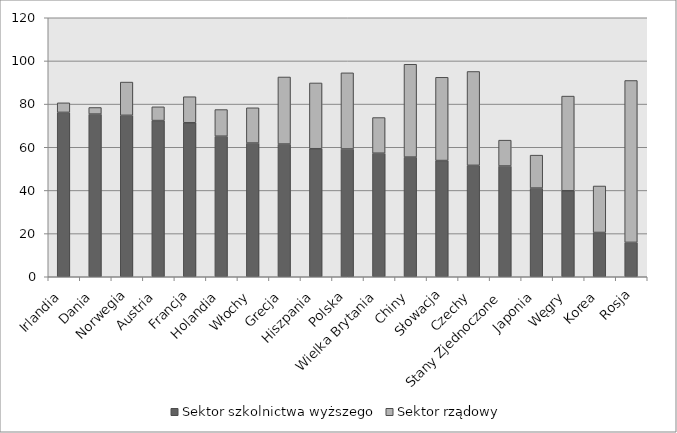
| Category | Sektor szkolnictwa wyższego | Sektor rządowy |
|---|---|---|
| Irlandia | 76.156 | 4.43 |
| Dania | 75.369 | 3.061 |
| Norwegia | 74.783 | 15.419 |
| Austria | 72.36 | 6.378 |
| Francja | 71.352 | 12.062 |
| Holandia | 65.112 | 12.354 |
| Włochy | 61.941 | 16.348 |
| Grecja | 61.484 | 31.079 |
| Hiszpania | 59.318 | 30.477 |
| Polska | 59.192 | 35.291 |
| Wielka Brytania | 57.241 | 16.522 |
| Chiny | 55.431 | 43.019 |
| Słowacja | 53.846 | 38.567 |
| Czechy | 51.617 | 43.496 |
| Stany Zjednoczone | 51.299 | 11.991 |
| Japonia | 41.082 | 15.265 |
| Węgry | 39.853 | 43.852 |
| Korea | 20.51 | 21.536 |
| Rosja | 15.922 | 75.014 |